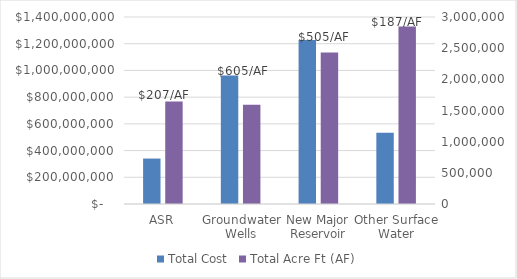
| Category | Total Cost | Series 2 |
|---|---|---|
| ASR | 340316000 |  |
| Groundwater Wells | 961682000 |  |
| New Major Reservoir | 1228223000 |  |
| Other Surface Water | 533414335 |  |